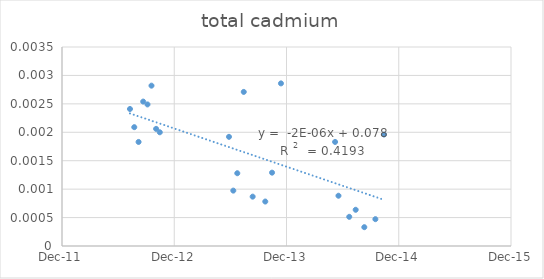
| Category | Series 0 |
|---|---|
| 41101.0 | 0.002 |
| 41115.0 | 0.002 |
| 41129.0 | 0.002 |
| 41144.0 | 0.003 |
| 41158.0 | 0.002 |
| 41171.0 | 0.003 |
| 41186.0 | 0.002 |
| 41198.0 | 0.002 |
| 41423.0 | 0.002 |
| 41437.0 | 0.001 |
| 41450.0 | 0.001 |
| 41471.0 | 0.003 |
| 41500.0 | 0.001 |
| 41541.0 | 0.001 |
| 41563.0 | 0.001 |
| 41592.0 | 0.003 |
| 41768.0 | 0.002 |
| 41779.0 | 0.001 |
| 41814.0 | 0.001 |
| 41835.0 | 0.001 |
| 41863.0 | 0 |
| 41899.0 | 0 |
| 41927.0 | 0.002 |